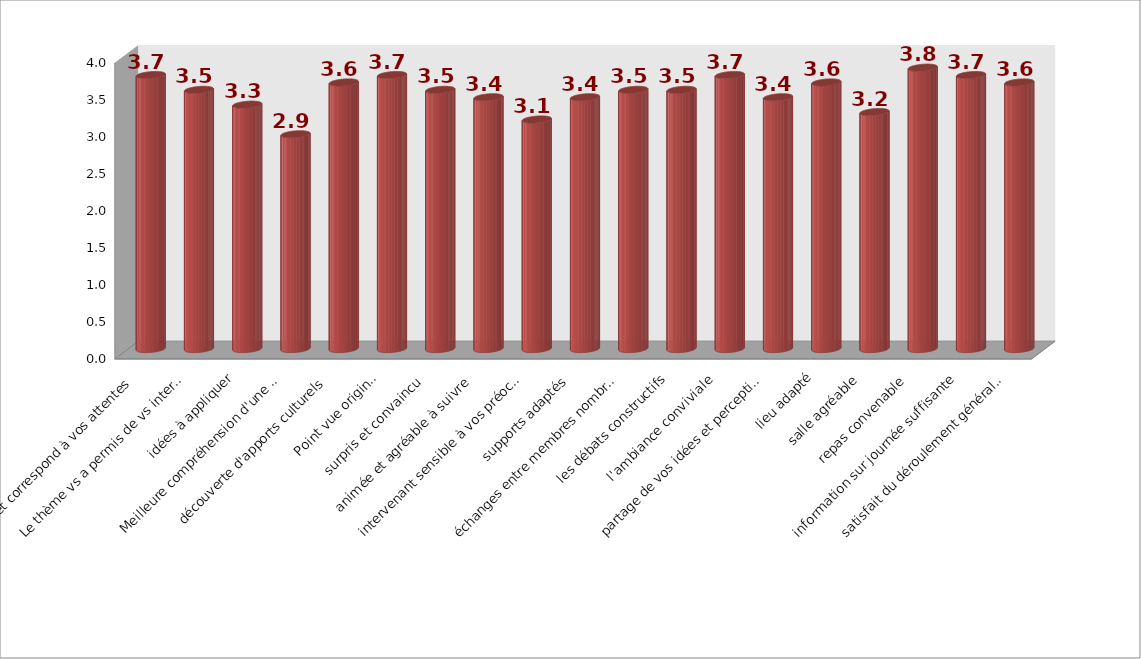
| Category | Series 1 |
|---|---|
| Sujet correspond à vos attentes | 3.7 |
| Le thème vs a permis de vs interroger sur vs mm | 3.5 |
| idées à appliquer | 3.3 |
| Meilleure compréhension d'une clé managériale | 2.9 |
| découverte d'apports culturels | 3.6 |
| Point vue original | 3.7 |
| surpris et convaincu | 3.5 |
| animée et agréable à suivre | 3.4 |
| intervenant sensible à vos préoccupations | 3.1 |
| supports adaptés | 3.4 |
| échanges entre membres nombreux | 3.5 |
| les débats constructifs | 3.5 |
| l'ambiance conviviale | 3.7 |
| partage de vos idées et perceptions | 3.4 |
| lieu adapté | 3.6 |
| salle agréable | 3.2 |
| repas convenable | 3.8 |
| information sur journée suffisante | 3.7 |
| satisfait du déroulement général réunion | 3.6 |